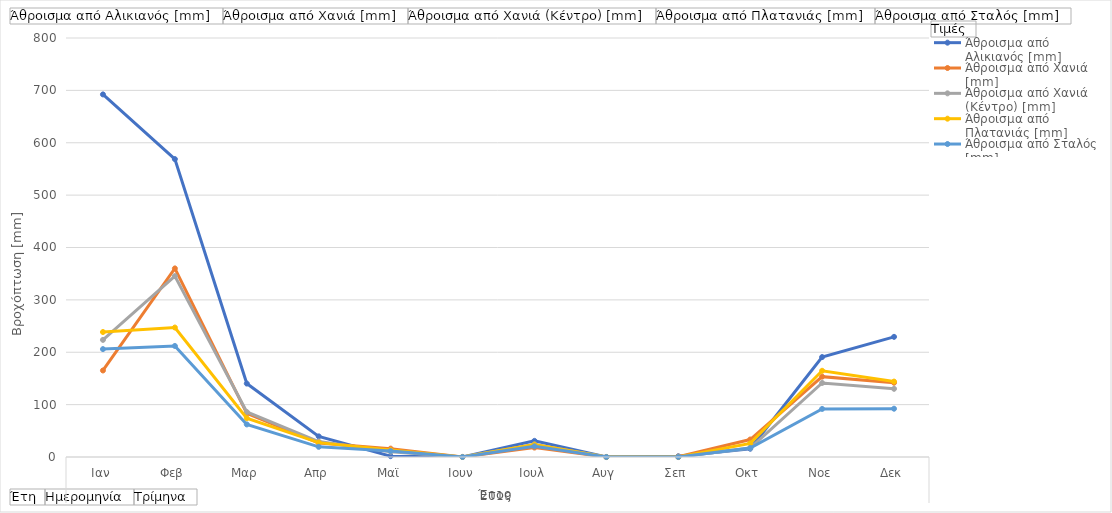
| Category | Άθροισμα από Αλικιανός [mm] | Άθροισμα από Χανιά [mm] | Άθροισμα από Χανιά (Κέντρο) [mm] | Άθροισμα από Πλατανιάς [mm] | Άθροισμα από Σταλός [mm] |
|---|---|---|---|---|---|
| 0 | 692.277 | 165.2 | 223.6 | 238.6 | 206 |
| 1 | 568.8 | 360 | 345.4 | 247.2 | 212 |
| 2 | 140.2 | 83.2 | 86 | 74 | 62.2 |
| 3 | 39.4 | 26.8 | 29.4 | 27.4 | 19.4 |
| 4 | 1.6 | 16 | 10 | 13.2 | 11.4 |
| 5 | 0 | 0.2 | 0 | 0 | 0 |
| 6 | 30.8 | 18 | 24 | 23.6 | 20.4 |
| 7 | 0 | 0 | 0 | 0 | 0 |
| 8 | 1.4 | 0.6 | 0 | 0 | 0 |
| 9 | 15.8 | 33.4 | 17.2 | 26 | 17.2 |
| 10 | 190.8 | 153.4 | 141.4 | 164.6 | 91.8 |
| 11 | 229.4 | 141.8 | 130.2 | 144 | 92.2 |